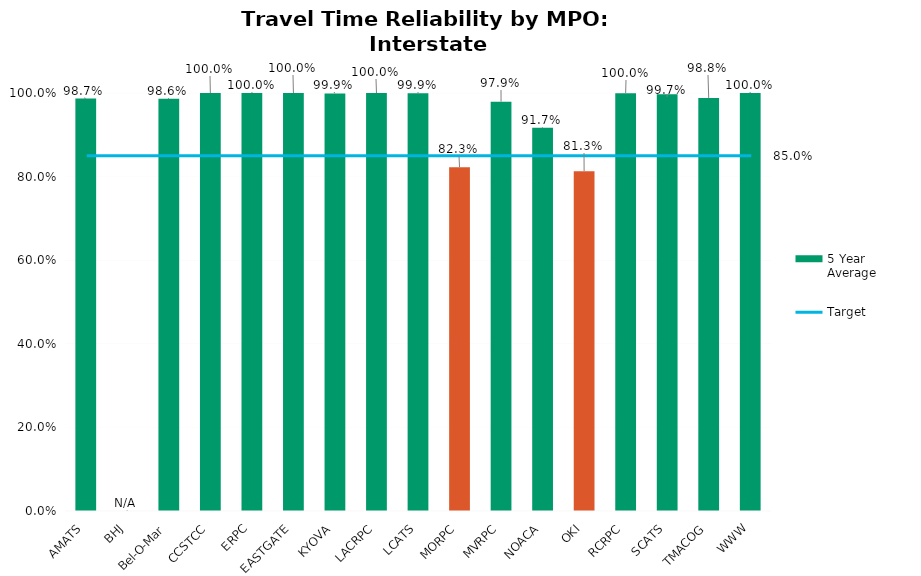
| Category | 5 Year Average |
|---|---|
| AMATS | 0.987 |
| BHJ | 0 |
| Bel-O-Mar | 0.986 |
| CCSTCC | 1 |
| ERPC | 1 |
| EASTGATE | 1 |
| KYOVA | 0.999 |
| LACRPC | 1 |
| LCATS | 0.999 |
| MORPC | 0.823 |
| MVRPC | 0.979 |
| NOACA | 0.917 |
| OKI | 0.813 |
| RCRPC | 1 |
| SCATS | 0.997 |
| TMACOG | 0.988 |
| WWW | 1 |